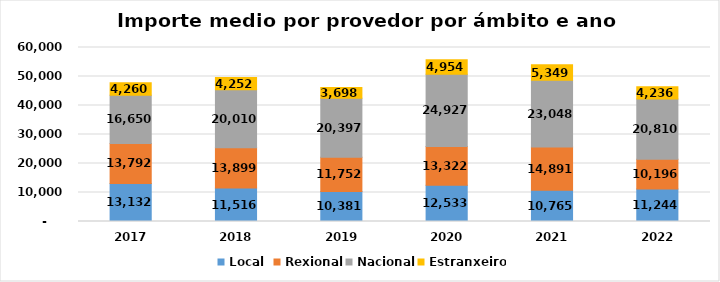
| Category | Local  | Rexional | Nacional | Estranxeiro |
|---|---|---|---|---|
| 2017.0 | 13132.48 | 13792.481 | 16649.888 | 4260.239 |
| 2018.0 | 11515.626 | 13898.72 | 20009.856 | 4252.076 |
| 2019.0 | 10380.961 | 11752.278 | 20397.298 | 3697.782 |
| 2020.0 | 12532.996 | 13322.488 | 24926.802 | 4954.425 |
| 2021.0 | 10764.77 | 14891.19 | 23047.83 | 5348.95 |
| 2022.0 | 11243.767 | 10196.298 | 20809.892 | 4235.535 |